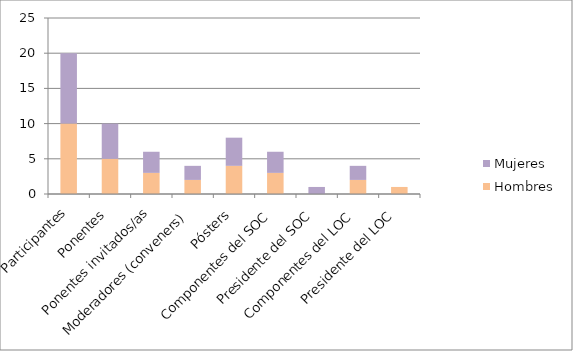
| Category | Hombres | Mujeres |
|---|---|---|
| Participantes | 10 | 10 |
| Ponentes | 5 | 5 |
| Ponentes invitados/as | 3 | 3 |
| Moderadores (conveners) | 2 | 2 |
| Pósters | 4 | 4 |
| Componentes del SOC | 3 | 3 |
| Presidente del SOC | 0 | 1 |
| Componentes del LOC | 2 | 2 |
| Presidente del LOC | 1 | 0 |